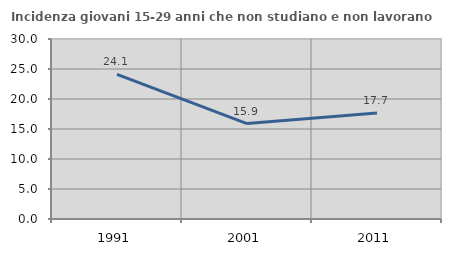
| Category | Incidenza giovani 15-29 anni che non studiano e non lavorano  |
|---|---|
| 1991.0 | 24.096 |
| 2001.0 | 15.897 |
| 2011.0 | 17.67 |